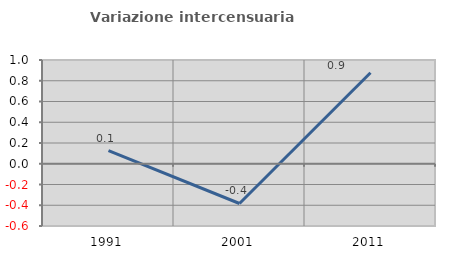
| Category | Variazione intercensuaria annua |
|---|---|
| 1991.0 | 0.126 |
| 2001.0 | -0.383 |
| 2011.0 | 0.878 |